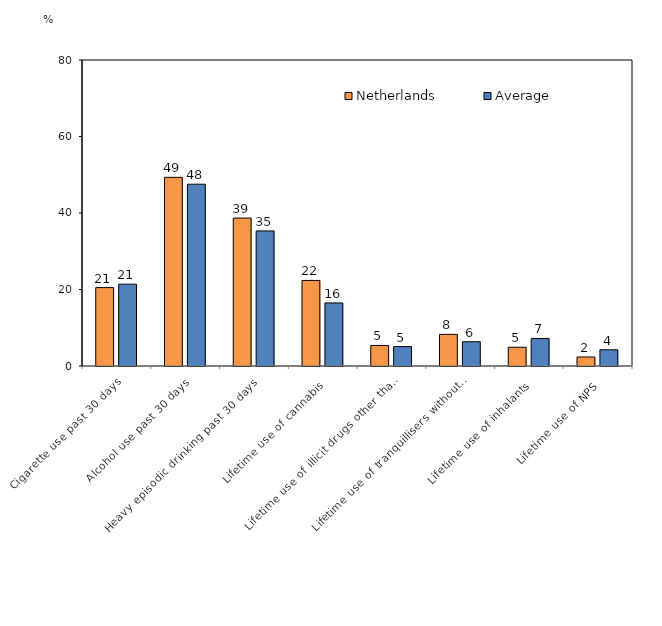
| Category | Netherlands | Average |
|---|---|---|
| Cigarette use past 30 days | 20.5 | 21.397 |
| Alcohol use past 30 days | 49.32 | 47.531 |
| Heavy episodic drinking past 30 days | 38.68 | 35.309 |
| Lifetime use of cannabis | 22.37 | 16.48 |
| Lifetime use of illicit drugs other than cannabis | 5.37 | 5.079 |
| Lifetime use of tranquillisers without prescription  | 8.27 | 6.34 |
| Lifetime use of inhalants | 4.9 | 7.202 |
| Lifetime use of NPS | 2.36 | 4.246 |